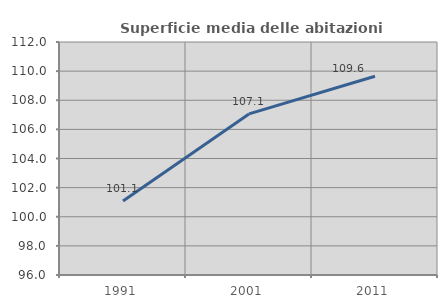
| Category | Superficie media delle abitazioni occupate |
|---|---|
| 1991.0 | 101.077 |
| 2001.0 | 107.061 |
| 2011.0 | 109.65 |